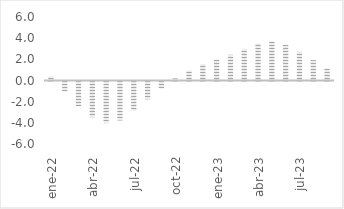
| Category | Total |
|---|---|
| ene-22 | 0.393 |
| feb-22 | -0.95 |
| mar-22 | -2.314 |
| abr-22 | -3.38 |
| may-22 | -3.936 |
| jun-22 | -3.684 |
| jul-22 | -2.787 |
| ago-22 | -1.689 |
| sep-22 | -0.652 |
| oct-22 | 0.2 |
| nov-22 | 0.947 |
| dic-22 | 1.559 |
| ene-23 | 1.983 |
| feb-23 | 2.43 |
| mar-23 | 2.982 |
| abr-23 | 3.507 |
| may-23 | 3.696 |
| jun-23 | 3.364 |
| jul-23 | 2.715 |
| ago-23 | 1.929 |
| sep-23 | 1.134 |